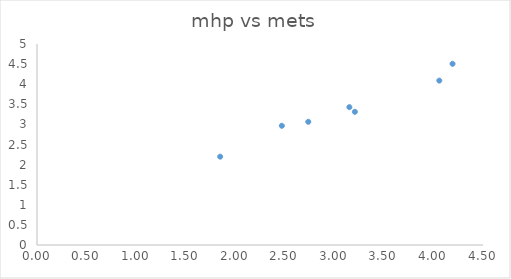
| Category | mhp vs mets  |
|---|---|
| 1.8481481481481483 | 2.197 |
| 2.4703703703703708 | 2.965 |
| 2.7370370370370374 | 3.064 |
| 3.151851851851852 | 3.429 |
| 3.2074074074074077 | 3.313 |
| 4.192592592592593 | 4.508 |
| 4.059259259259259 | 4.089 |